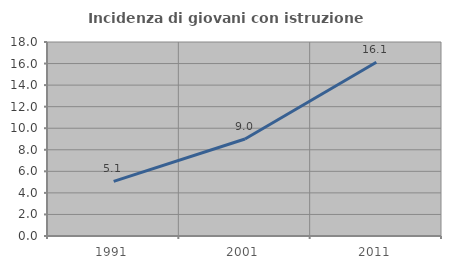
| Category | Incidenza di giovani con istruzione universitaria |
|---|---|
| 1991.0 | 5.063 |
| 2001.0 | 9 |
| 2011.0 | 16.117 |